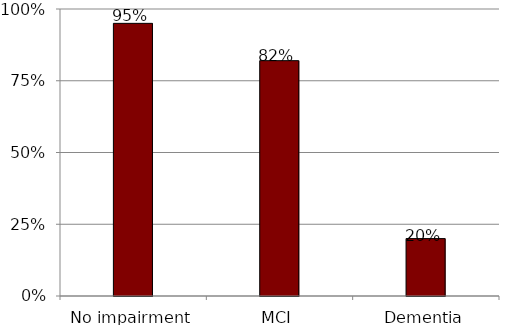
| Category | Series 0 |
|---|---|
| No impairment | 0.95 |
| MCI | 0.82 |
| Dementia | 0.2 |